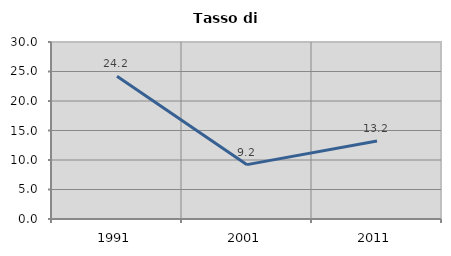
| Category | Tasso di disoccupazione   |
|---|---|
| 1991.0 | 24.178 |
| 2001.0 | 9.214 |
| 2011.0 | 13.22 |